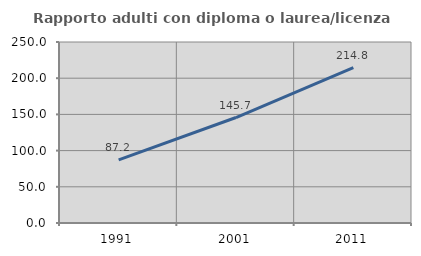
| Category | Rapporto adulti con diploma o laurea/licenza media  |
|---|---|
| 1991.0 | 87.2 |
| 2001.0 | 145.695 |
| 2011.0 | 214.754 |